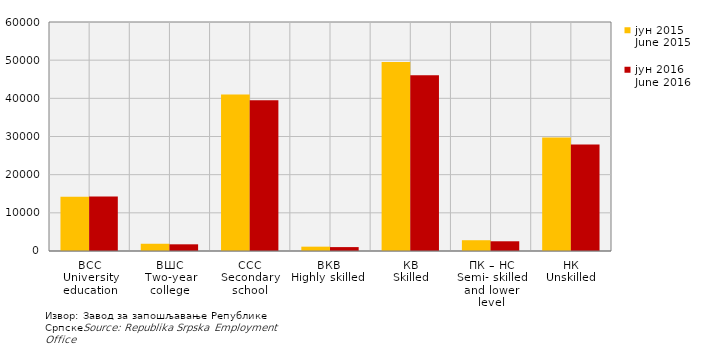
| Category | јун 2015
June 2015 | јун 2016
June 2016 |
|---|---|---|
| ВСС
University education | 14198 | 14311 |
| ВШС
Two-year college | 1897 | 1752 |
| ССС
Secondary school | 41022 | 39492 |
| ВКВ 
Highly skilled    | 1135 | 1023 |
| КВ
Skilled | 49497 | 46016 |
| ПК – НС
Semi- skilled and lower level | 2821 | 2548 |
| НК
Unskilled | 29724 | 27899 |